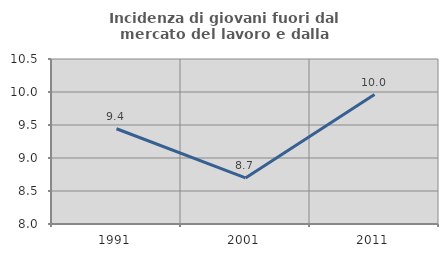
| Category | Incidenza di giovani fuori dal mercato del lavoro e dalla formazione  |
|---|---|
| 1991.0 | 9.443 |
| 2001.0 | 8.699 |
| 2011.0 | 9.96 |